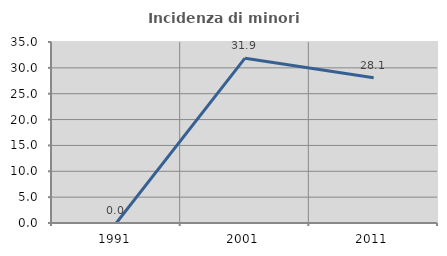
| Category | Incidenza di minori stranieri |
|---|---|
| 1991.0 | 0 |
| 2001.0 | 31.868 |
| 2011.0 | 28.082 |